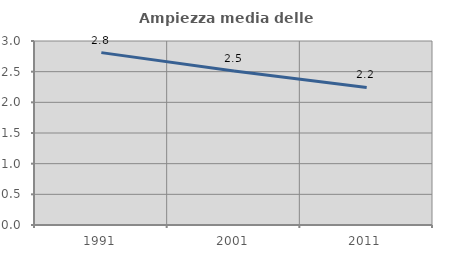
| Category | Ampiezza media delle famiglie |
|---|---|
| 1991.0 | 2.81 |
| 2001.0 | 2.511 |
| 2011.0 | 2.243 |